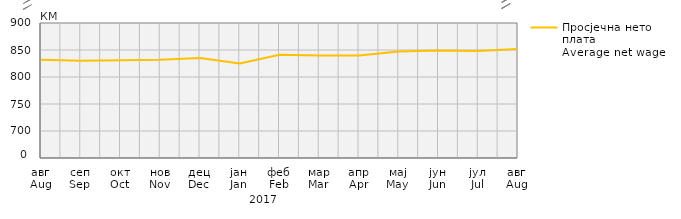
| Category | Просјечна нето плата
Average net wage |
|---|---|
| авг
Aug | 832 |
| сеп
Sep | 830 |
| окт
Oct | 831 |
| нов
Nov | 832 |
| дец
Dec | 835 |
| јан
Jan | 825 |
| феб
Feb | 841 |
| мар
Mar | 840 |
| апр
Apr | 840 |
| мај
May | 847 |
| јун
Jun | 849 |
| јул
Jul | 848 |
| авг
Aug | 852 |